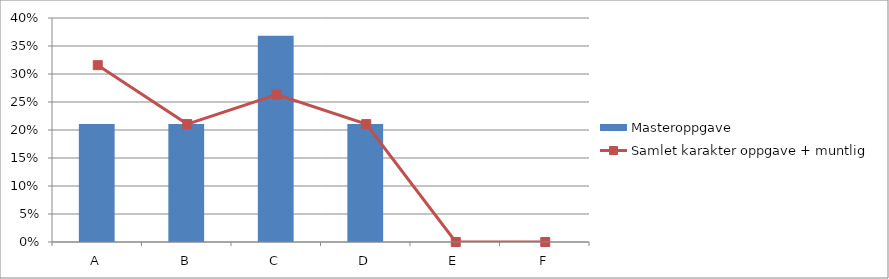
| Category | Masteroppgave |
|---|---|
| A | 0.211 |
| B | 0.211 |
| C | 0.368 |
| D | 0.211 |
| E | 0 |
| F | 0 |